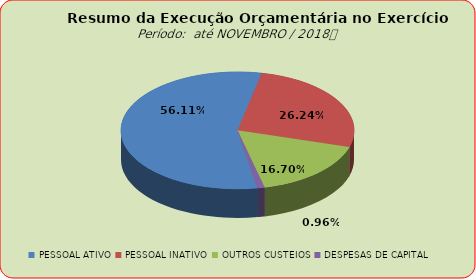
| Category | Series 0 |
|---|---|
| PESSOAL ATIVO | 135676398.03 |
| PESSOAL INATIVO | 63441694.75 |
| OUTROS CUSTEIOS | 40371081.65 |
| DESPESAS DE CAPITAL | 2324242.1 |